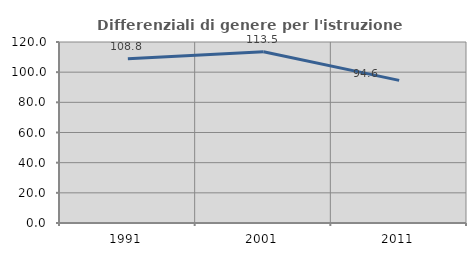
| Category | Differenziali di genere per l'istruzione superiore |
|---|---|
| 1991.0 | 108.833 |
| 2001.0 | 113.497 |
| 2011.0 | 94.554 |